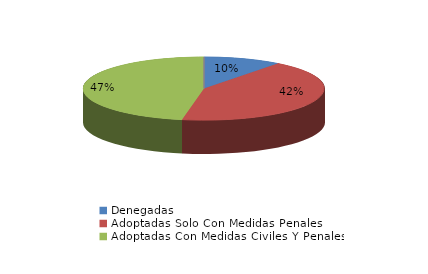
| Category | Series 0 |
|---|---|
| Denegadas | 27 |
| Adoptadas Solo Con Medidas Penales | 110 |
| Adoptadas Con Medidas Civiles Y Penales | 122 |
| Adoptadas Con Medidas Solo Civiles | 0 |